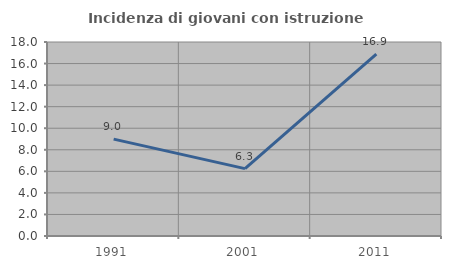
| Category | Incidenza di giovani con istruzione universitaria |
|---|---|
| 1991.0 | 8.989 |
| 2001.0 | 6.25 |
| 2011.0 | 16.867 |